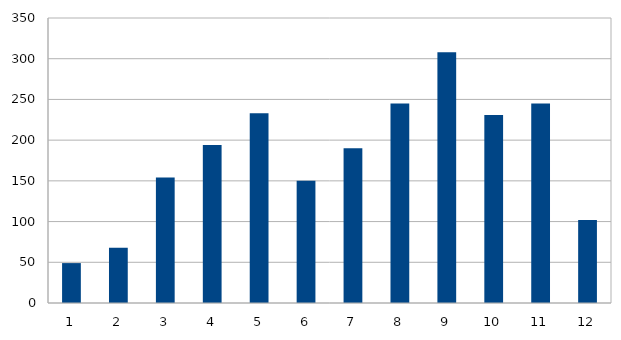
| Category | Series 0 |
|---|---|
| 0 | 49 |
| 1 | 68 |
| 2 | 154 |
| 3 | 194 |
| 4 | 233 |
| 5 | 150 |
| 6 | 190 |
| 7 | 245 |
| 8 | 308 |
| 9 | 231 |
| 10 | 245 |
| 11 | 102 |